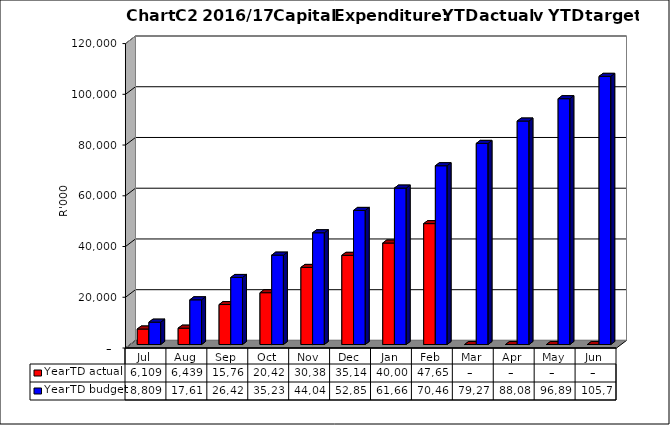
| Category | YearTD actual | YearTD budget |
|---|---|---|
| Jul | 6108587 | 8808585.26 |
| Aug | 6439262 | 17617170.52 |
| Sep | 15760781 | 26425755.78 |
| Oct | 20424714 | 35234341.04 |
| Nov | 30383869 | 44042926.3 |
| Dec | 35145694 | 52851511.56 |
| Jan | 40003745 | 61660096.821 |
| Feb | 47652521 | 70468682.081 |
| Mar | 0 | 79277267.341 |
| Apr | 0 | 88085852.601 |
| May | 0 | 96894437.861 |
| Jun | 0 | 105703023.121 |